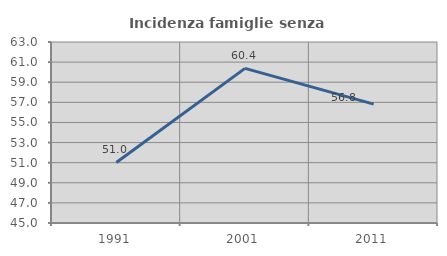
| Category | Incidenza famiglie senza nuclei |
|---|---|
| 1991.0 | 51.02 |
| 2001.0 | 60.377 |
| 2011.0 | 56.818 |